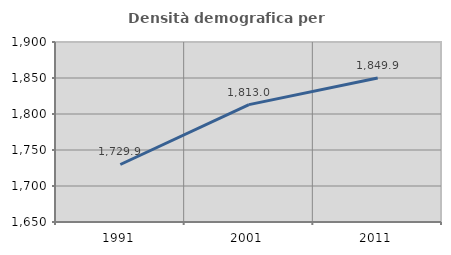
| Category | Densità demografica |
|---|---|
| 1991.0 | 1729.864 |
| 2001.0 | 1813.017 |
| 2011.0 | 1849.92 |